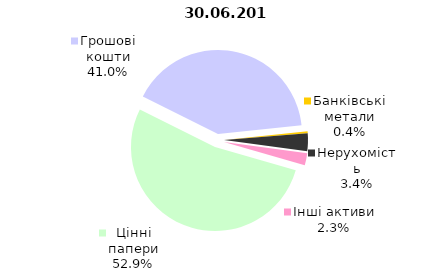
| Category | 30.06.2017 |
|---|---|
| Цінні папери | 1190.1 |
| Грошові кошти | 921.3 |
| Банківські метали | 9.1 |
| Нерухомість | 75.8 |
| Інші активи | 52.4 |